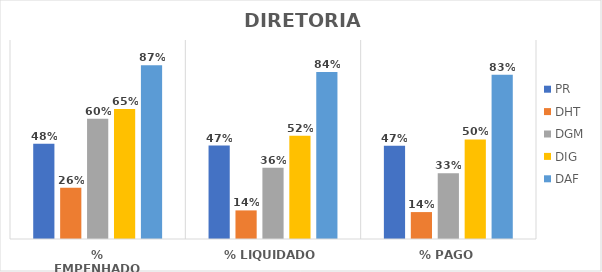
| Category | PR | DHT | DGM | DIG | DAF |
|---|---|---|---|---|---|
| % EMPENHADO | 0.479 | 0.258 | 0.604 | 0.654 | 0.873 |
| % LIQUIDADO | 0.47 | 0.144 | 0.358 | 0.519 | 0.839 |
| % PAGO | 0.469 | 0.135 | 0.331 | 0.5 | 0.825 |